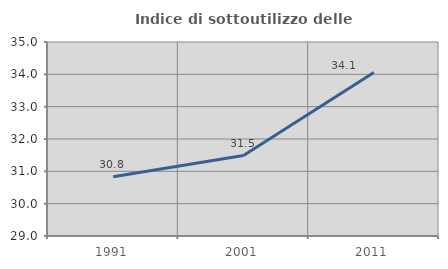
| Category | Indice di sottoutilizzo delle abitazioni  |
|---|---|
| 1991.0 | 30.833 |
| 2001.0 | 31.487 |
| 2011.0 | 34.059 |